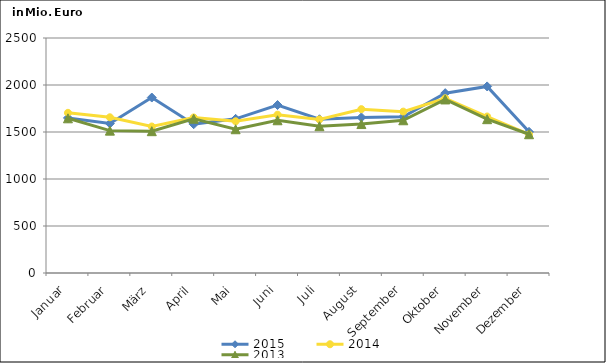
| Category | 2015 | 2014 | 2013 |
|---|---|---|---|
| Januar | 1649.554 | 1704.053 | 1645.618 |
| Februar | 1590.268 | 1656.484 | 1514.603 |
| März | 1866.664 | 1558.399 | 1508.683 |
| April | 1582.798 | 1654.604 | 1641.027 |
| Mai | 1639.924 | 1614.266 | 1529.369 |
| Juni | 1786.893 | 1683.936 | 1624.951 |
| Juli | 1635.183 | 1634.249 | 1561.548 |
| August | 1655.404 | 1742.811 | 1584.449 |
| September | 1662.606 | 1716.646 | 1624.959 |
| Oktober | 1913.109 | 1858.769 | 1846.311 |
| November | 1984.938 | 1664.745 | 1636.355 |
| Dezember | 1501.624 | 1474 | 1476.287 |